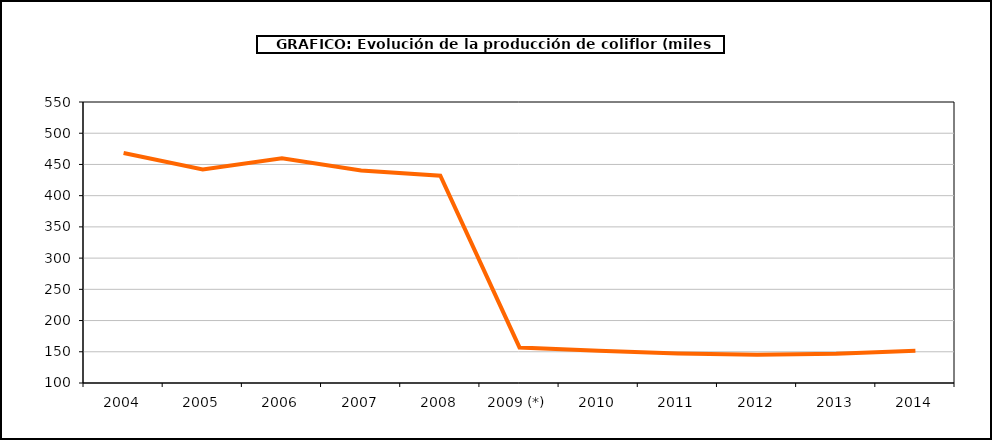
| Category | producción |
|---|---|
| 2004 | 468.344 |
| 2005 | 441.8 |
| 2006 | 460 |
| 2007 | 440.254 |
| 2008 | 431.911 |
| 2009 (*) | 156.937 |
| 2010 | 151.573 |
| 2011 | 147.3 |
| 2012 | 145.268 |
| 2013 | 146.724 |
| 2014 | 151.651 |